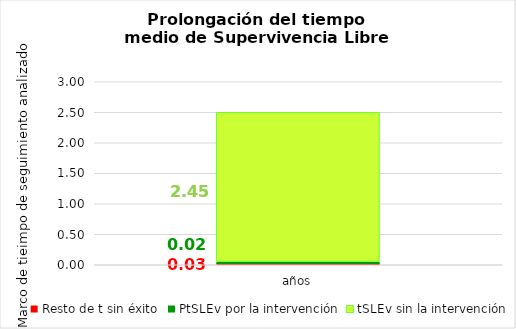
| Category | Resto de t sin éxito | PtSLEv por la intervención | tSLEv sin la intervención |
|---|---|---|---|
| años | 0.032 | 0.021 | 2.447 |